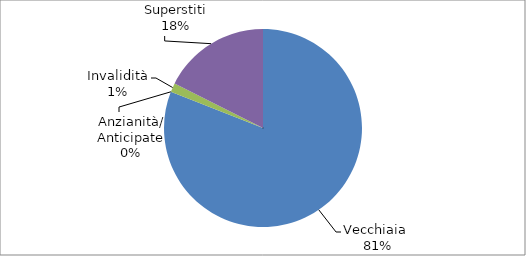
| Category | Series 0 |
|---|---|
| Vecchiaia  | 24156 |
| Anzianità/ Anticipate | 0 |
| Invalidità | 443 |
| Superstiti | 5239 |